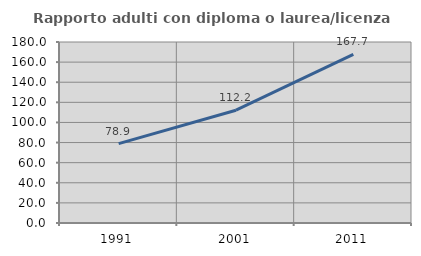
| Category | Rapporto adulti con diploma o laurea/licenza media  |
|---|---|
| 1991.0 | 78.92 |
| 2001.0 | 112.168 |
| 2011.0 | 167.695 |